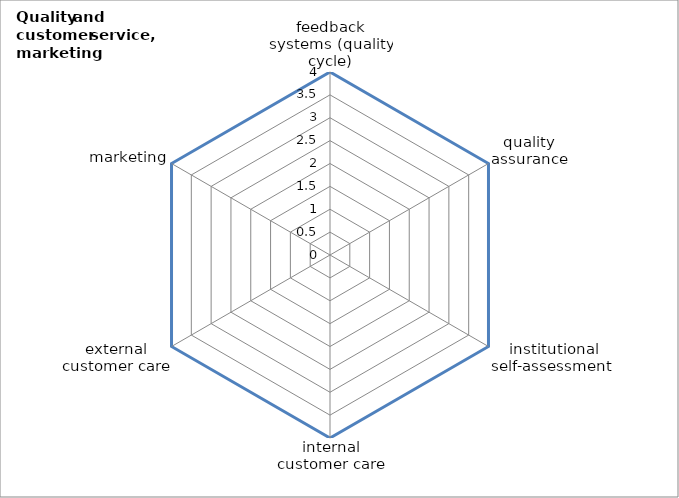
| Category | Series 0 | Series 1 |
|---|---|---|
| feedback systems (quality cycle) | 4 |  |
| quality assurance | 4 |  |
| institutional self-assessment  | 4 |  |
| internal customer care | 4 |  |
| external customer care | 4 |  |
| marketing | 4 |  |